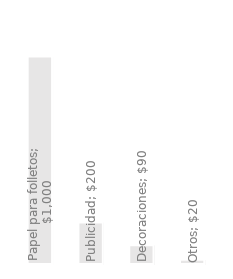
| Category | Gastos anuales |
|---|---|
| Papel para folletos | 1000 |
| Publicidad | 200 |
| Decoraciones | 90 |
| Otros | 20 |